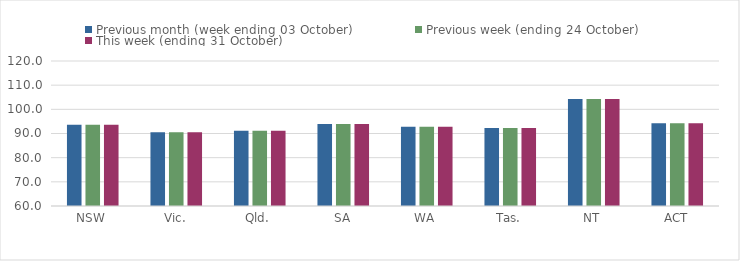
| Category | Previous month (week ending 03 October) | Previous week (ending 24 October) | This week (ending 31 October) |
|---|---|---|---|
| NSW | 93.65 | 93.65 | 93.65 |
| Vic. | 90.56 | 90.56 | 90.56 |
| Qld. | 91.11 | 91.11 | 91.11 |
| SA | 93.92 | 93.92 | 93.92 |
| WA | 92.75 | 92.75 | 92.75 |
| Tas. | 92.25 | 92.25 | 92.25 |
| NT | 104.27 | 104.27 | 104.27 |
| ACT | 94.29 | 94.29 | 94.29 |